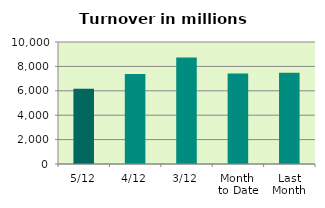
| Category | Series 0 |
|---|---|
| 5/12 | 6163.119 |
| 4/12 | 7378.41 |
| 3/12 | 8720.976 |
| Month 
to Date | 7420.835 |
| Last
Month | 7475.09 |